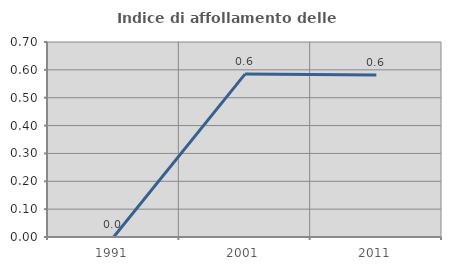
| Category | Indice di affollamento delle abitazioni  |
|---|---|
| 1991.0 | 0 |
| 2001.0 | 0.585 |
| 2011.0 | 0.581 |